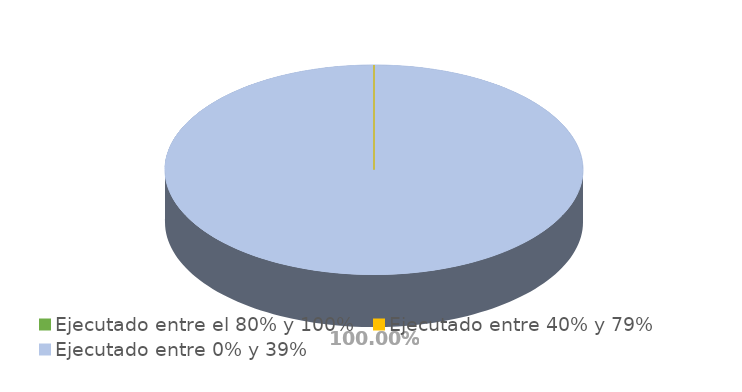
| Category | Series 0 |
|---|---|
| Ejecutado entre el 80% y 100% | 0 |
| Ejecutado entre 40% y 79% | 0 |
| Ejecutado entre 0% y 39% | 1 |